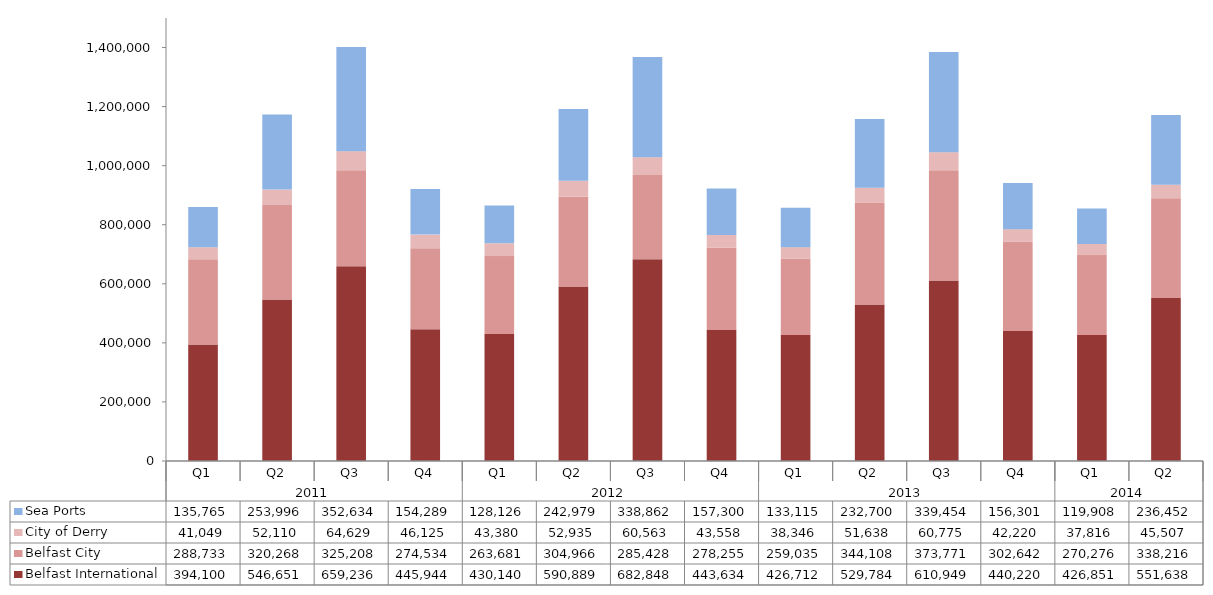
| Category | Belfast International  | Belfast City  | City of Derry | Sea Ports  |
|---|---|---|---|---|
| 0 | 394100 | 288733 | 41049 | 135765 |
| 1 | 546651 | 320268 | 52110 | 253996 |
| 2 | 659236 | 325208 | 64629 | 352634 |
| 3 | 445944 | 274534 | 46125 | 154289 |
| 4 | 430140 | 263681 | 43380 | 128126 |
| 5 | 590889 | 304966 | 52935 | 242979 |
| 6 | 682848 | 285428 | 60563 | 338862 |
| 7 | 443634 | 278255 | 43558 | 157300 |
| 8 | 426712 | 259035 | 38346 | 133115 |
| 9 | 529784 | 344108 | 51638 | 232700 |
| 10 | 610949 | 373771 | 60775 | 339454 |
| 11 | 440220 | 302642 | 42220 | 156301 |
| 12 | 426851 | 270276 | 37816 | 119908 |
| 13 | 551638 | 338216 | 45507 | 236452 |